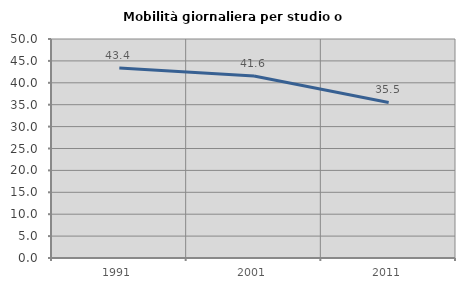
| Category | Mobilità giornaliera per studio o lavoro |
|---|---|
| 1991.0 | 43.373 |
| 2001.0 | 41.558 |
| 2011.0 | 35.514 |